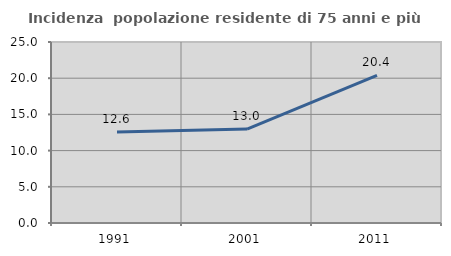
| Category | Incidenza  popolazione residente di 75 anni e più |
|---|---|
| 1991.0 | 12.581 |
| 2001.0 | 12.981 |
| 2011.0 | 20.38 |